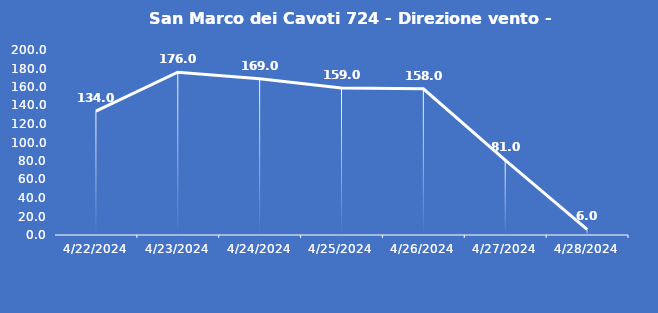
| Category | San Marco dei Cavoti 724 - Direzione vento - Grezzo (°N) |
|---|---|
| 4/22/24 | 134 |
| 4/23/24 | 176 |
| 4/24/24 | 169 |
| 4/25/24 | 159 |
| 4/26/24 | 158 |
| 4/27/24 | 81 |
| 4/28/24 | 6 |